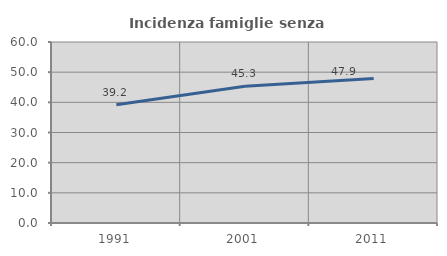
| Category | Incidenza famiglie senza nuclei |
|---|---|
| 1991.0 | 39.173 |
| 2001.0 | 45.316 |
| 2011.0 | 47.879 |